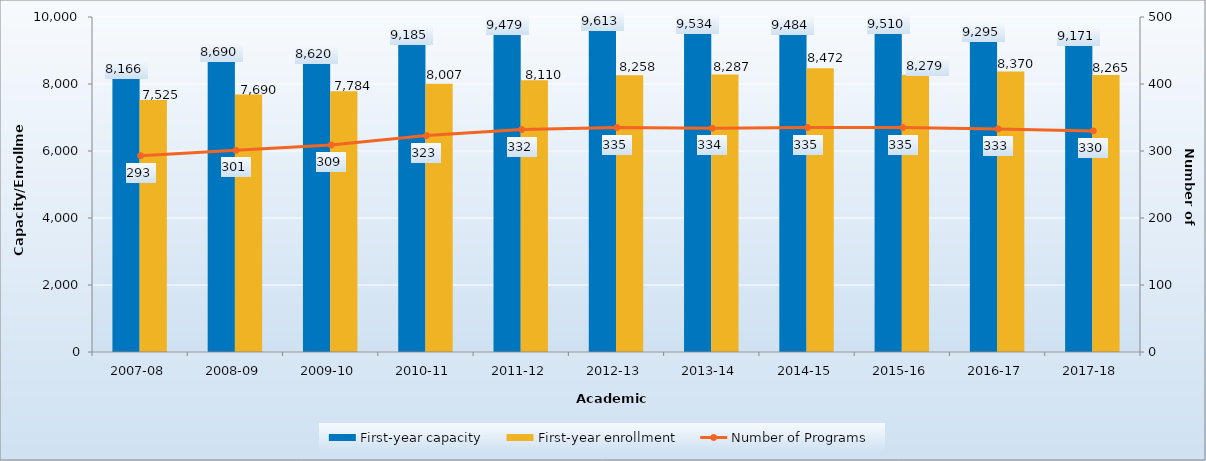
| Category | First-year capacity | First-year enrollment |
|---|---|---|
| 2007-08 | 8166 | 7525 |
| 2008-09 | 8690 | 7690 |
| 2009-10 | 8620 | 7784 |
| 2010-11 | 9185 | 8007 |
| 2011-12 | 9479 | 8110 |
| 2012-13 | 9613 | 8258 |
| 2013-14 | 9534 | 8287 |
| 2014-15 | 9484 | 8472 |
| 2015-16 | 9510 | 8279 |
| 2016-17 | 9295 | 8370 |
| 2017-18 | 9171 | 8265 |